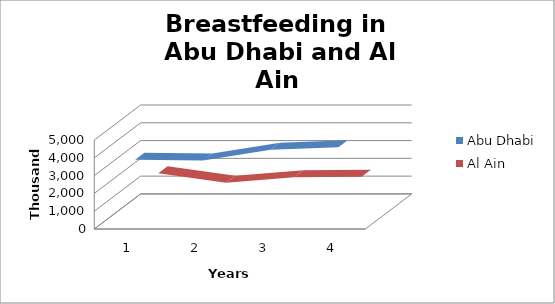
| Category | Abu Dhabi | Al Ain |
|---|---|---|
| 0 | 3509 | 1765 |
| 1 | 3476 | 1234 |
| 2 | 4073 | 1542 |
| 3 | 4216 | 1579 |